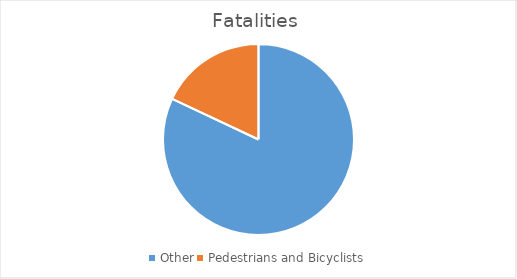
| Category | Fatalities |
|---|---|
| Other | 0.82 |
| Pedestrians and Bicyclists | 0.18 |